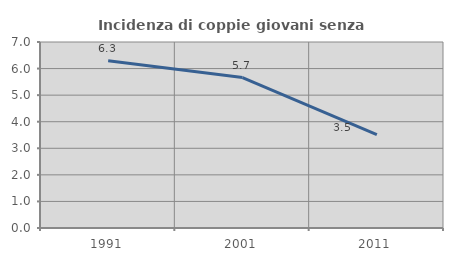
| Category | Incidenza di coppie giovani senza figli |
|---|---|
| 1991.0 | 6.292 |
| 2001.0 | 5.66 |
| 2011.0 | 3.516 |